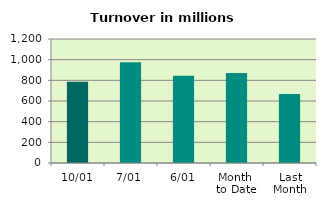
| Category | Series 0 |
|---|---|
| 10/01 | 785.679 |
| 7/01 | 975.489 |
| 6/01 | 844.759 |
| Month 
to Date | 869.791 |
| Last
Month | 667.375 |